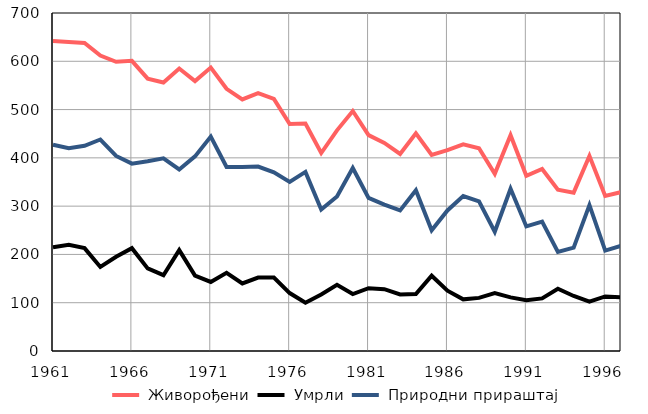
| Category |  Живорођени |  Умрли |  Природни прираштај |
|---|---|---|---|
| 1961.0 | 642 | 215 | 427 |
| 1962.0 | 640 | 220 | 420 |
| 1963.0 | 638 | 213 | 425 |
| 1964.0 | 612 | 174 | 438 |
| 1965.0 | 599 | 195 | 404 |
| 1966.0 | 601 | 213 | 388 |
| 1967.0 | 564 | 171 | 393 |
| 1968.0 | 556 | 157 | 399 |
| 1969.0 | 585 | 209 | 376 |
| 1970.0 | 559 | 156 | 403 |
| 1971.0 | 587 | 143 | 444 |
| 1972.0 | 543 | 162 | 381 |
| 1973.0 | 521 | 140 | 381 |
| 1974.0 | 534 | 152 | 382 |
| 1975.0 | 522 | 152 | 370 |
| 1976.0 | 470 | 120 | 350 |
| 1977.0 | 471 | 100 | 371 |
| 1978.0 | 410 | 117 | 293 |
| 1979.0 | 457 | 137 | 320 |
| 1980.0 | 497 | 118 | 379 |
| 1981.0 | 447 | 130 | 317 |
| 1982.0 | 431 | 128 | 303 |
| 1983.0 | 408 | 117 | 291 |
| 1984.0 | 451 | 118 | 333 |
| 1985.0 | 406 | 156 | 250 |
| 1986.0 | 416 | 125 | 291 |
| 1987.0 | 428 | 107 | 321 |
| 1988.0 | 420 | 110 | 310 |
| 1989.0 | 367 | 120 | 247 |
| 1990.0 | 447 | 111 | 336 |
| 1991.0 | 363 | 105 | 258 |
| 1992.0 | 377 | 109 | 268 |
| 1993.0 | 334 | 129 | 205 |
| 1994.0 | 328 | 114 | 214 |
| 1995.0 | 404 | 102 | 302 |
| 1996.0 | 321 | 113 | 208 |
| 1997.0 | 329 | 111 | 218 |